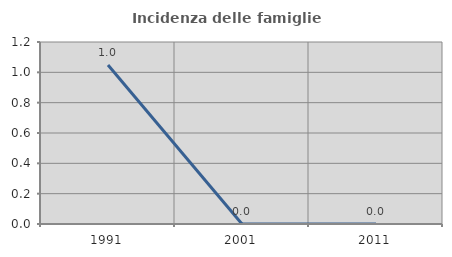
| Category | Incidenza delle famiglie numerose |
|---|---|
| 1991.0 | 1.049 |
| 2001.0 | 0 |
| 2011.0 | 0 |